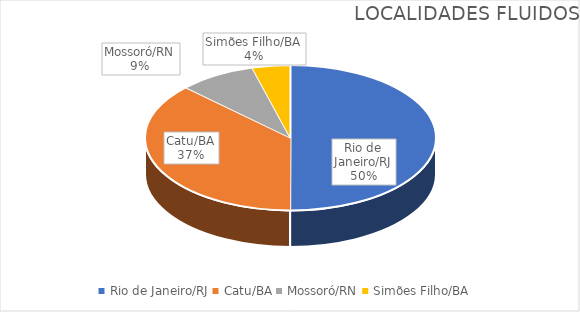
| Category | Series 0 |
|---|---|
| Rio de Janeiro/RJ | 1381 |
| Catu/BA | 1026 |
| Mossoró/RN | 236 |
| Simões Filho/BA | 117 |